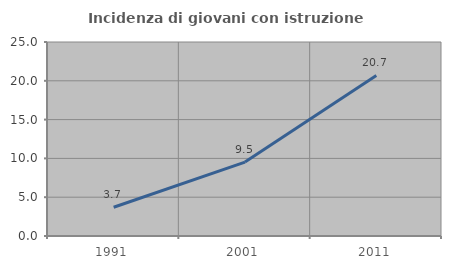
| Category | Incidenza di giovani con istruzione universitaria |
|---|---|
| 1991.0 | 3.704 |
| 2001.0 | 9.524 |
| 2011.0 | 20.69 |